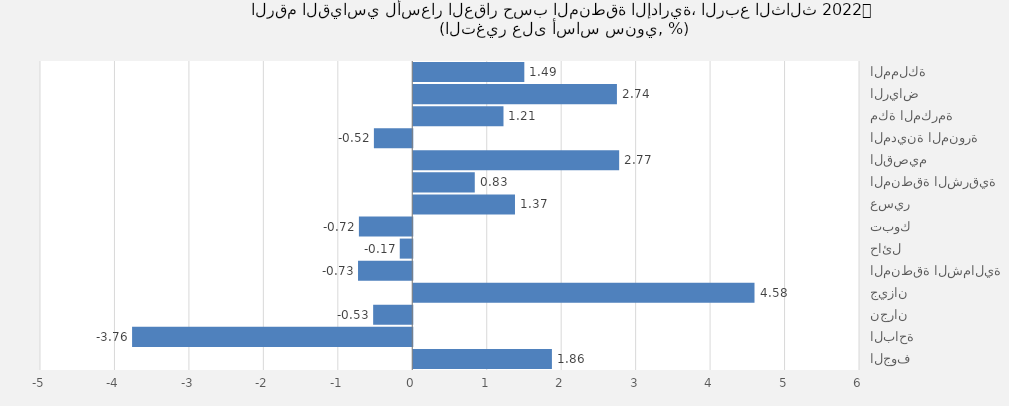
| Category | 2022 |
|---|---|
| المملكة | 1.492 |
| الرياض | 2.735 |
| مكة المكرمة | 1.212 |
| المدينة المنورة | -0.515 |
| القصيم | 2.765 |
| المنطقة الشرقية | 0.826 |
| عسير | 1.366 |
| تبوك | -0.717 |
| حائل | -0.168 |
| المنطقة الشمالية | -0.729 |
| جيزان | 4.583 |
| نجران | -0.525 |
| الباحة | -3.763 |
| الجوف | 1.862 |